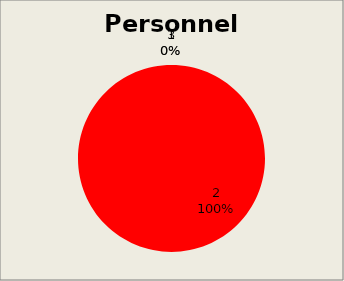
| Category | Series 2 |
|---|---|
| 0 | 0 |
| 1 | 12 |
| 2 | 0 |